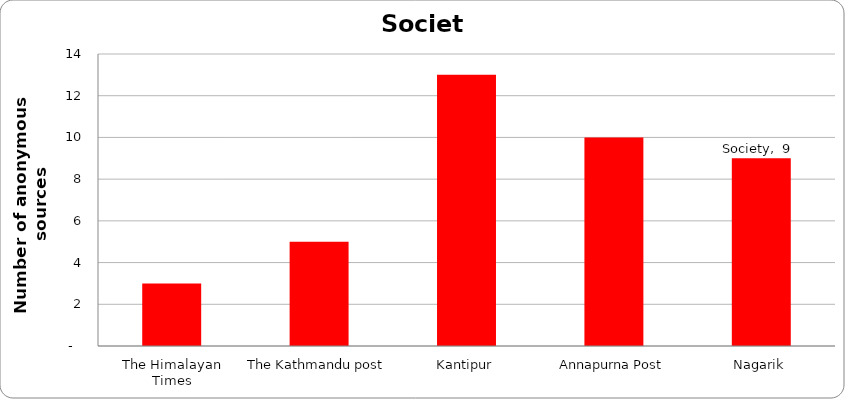
| Category | Society |
|---|---|
| The Himalayan Times | 3 |
| The Kathmandu post | 5 |
| Kantipur | 13 |
| Annapurna Post | 10 |
| Nagarik | 9 |